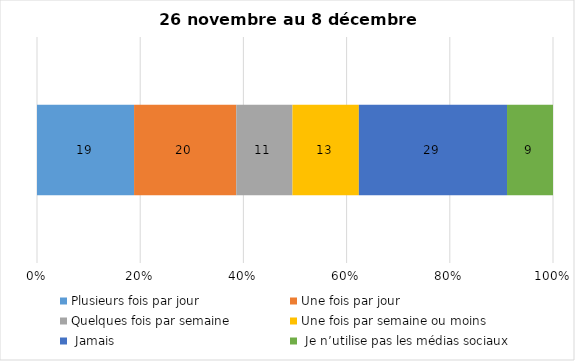
| Category | Plusieurs fois par jour | Une fois par jour | Quelques fois par semaine   | Une fois par semaine ou moins   |  Jamais   |  Je n’utilise pas les médias sociaux |
|---|---|---|---|---|---|---|
| 0 | 19 | 20 | 11 | 13 | 29 | 9 |